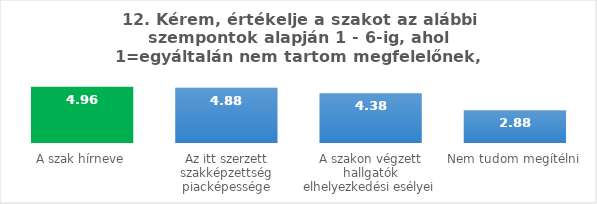
| Category | Series 0 |
|---|---|
| A szak hírneve | 4.96 |
| Az itt szerzett szakképzettség piacképessége | 4.88 |
| A szakon végzett hallgatók elhelyezkedési esélyei | 4.38 |
| Nem tudom megítélni | 2.88 |